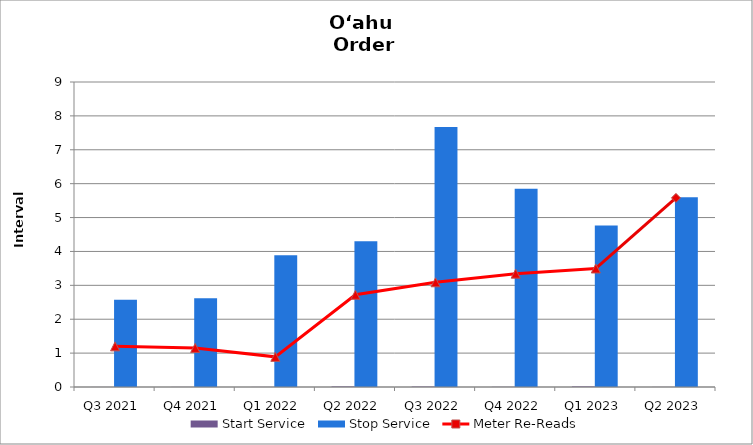
| Category | Start Service | Stop Service |
|---|---|---|
| Q3 2021 | 0.002 | 2.573 |
| Q4 2021 | 0.003 | 2.621 |
| Q1 2022 | 0.003 | 3.888 |
| Q2 2022 | 0.018 | 4.303 |
| Q3 2022 | 0.014 | 7.673 |
| Q4 2022 | 0.006 | 5.852 |
| Q1 2023 | 0.017 | 4.765 |
| Q2 2023 | 0.003 | 5.596 |